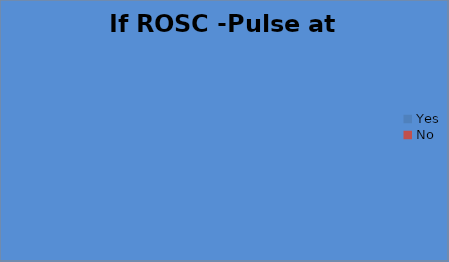
| Category | If ROSC -Pulse at Hospital |
|---|---|
| Yes | 0 |
| No | 0 |